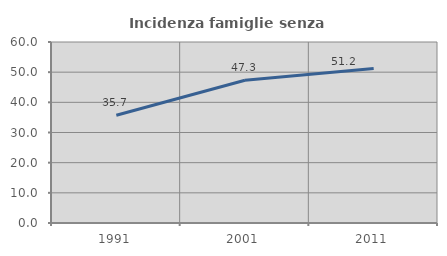
| Category | Incidenza famiglie senza nuclei |
|---|---|
| 1991.0 | 35.7 |
| 2001.0 | 47.335 |
| 2011.0 | 51.225 |